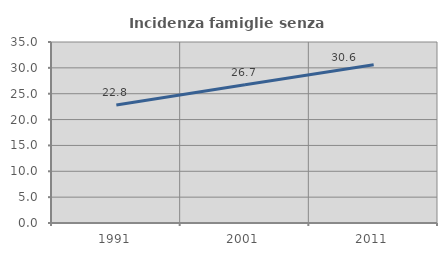
| Category | Incidenza famiglie senza nuclei |
|---|---|
| 1991.0 | 22.836 |
| 2001.0 | 26.716 |
| 2011.0 | 30.608 |